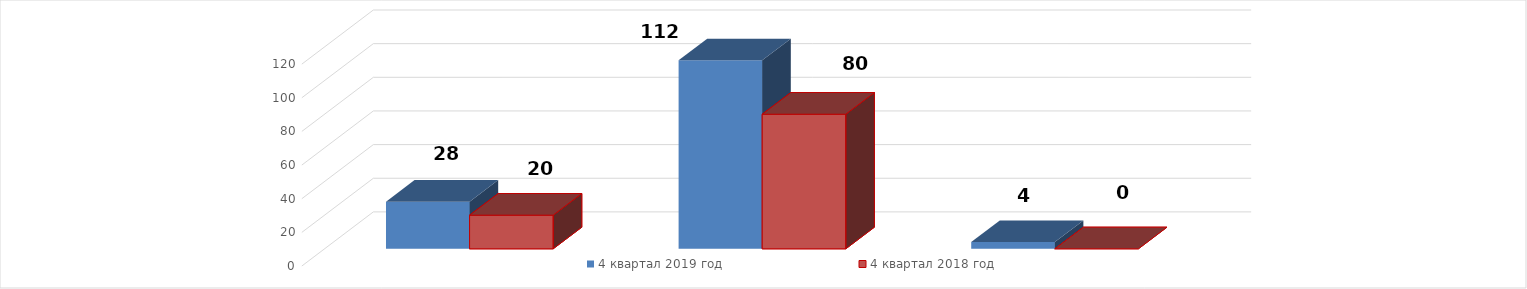
| Category | 4 квартал 2019 год | 4 квартал 2018 год |
|---|---|---|
| 4 квартал 2019 год | 28 | 20 |